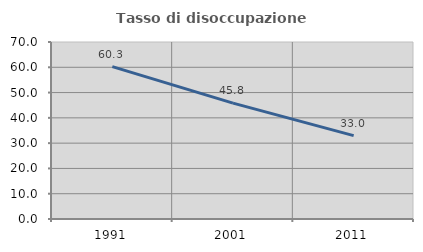
| Category | Tasso di disoccupazione giovanile  |
|---|---|
| 1991.0 | 60.256 |
| 2001.0 | 45.825 |
| 2011.0 | 32.973 |